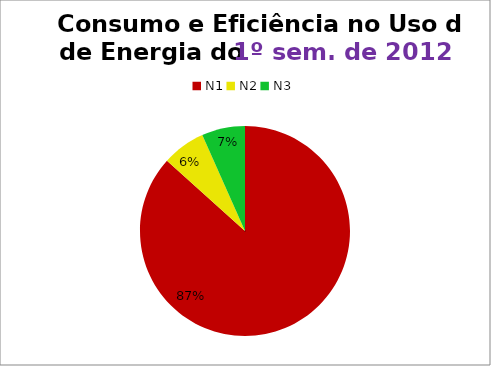
| Category | 1º/12 |
|---|---|
| N1 | 26 |
| N2 | 2 |
| N3 | 2 |